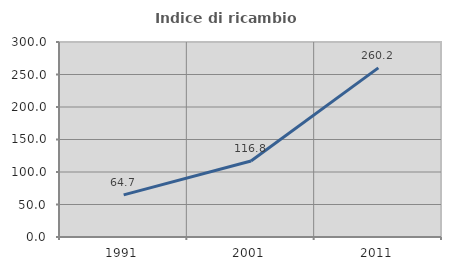
| Category | Indice di ricambio occupazionale  |
|---|---|
| 1991.0 | 64.745 |
| 2001.0 | 116.835 |
| 2011.0 | 260.196 |